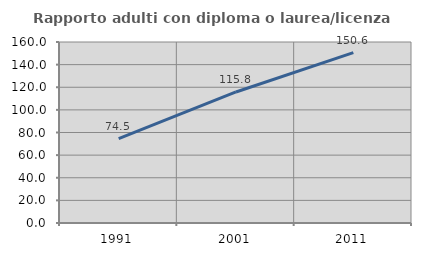
| Category | Rapporto adulti con diploma o laurea/licenza media  |
|---|---|
| 1991.0 | 74.517 |
| 2001.0 | 115.836 |
| 2011.0 | 150.579 |